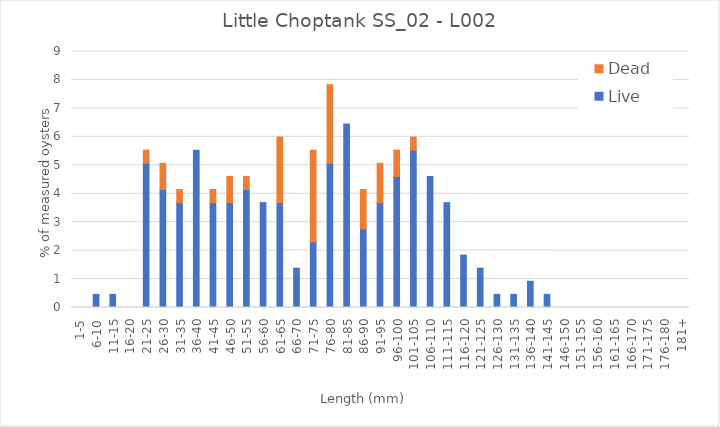
| Category | Live | Dead |
|---|---|---|
| 1-5 | 0 | 0 |
| 6-10 | 0.461 | 0 |
| 11-15 | 0.461 | 0 |
| 16-20 | 0 | 0 |
| 21-25 | 5.069 | 0.461 |
| 26-30 | 4.147 | 0.922 |
| 31-35 | 3.687 | 0.461 |
| 36-40 | 5.53 | 0 |
| 41-45 | 3.687 | 0.461 |
| 46-50 | 3.687 | 0.922 |
| 51-55 | 4.147 | 0.461 |
| 56-60 | 3.687 | 0 |
| 61-65 | 3.687 | 2.304 |
| 66-70 | 1.382 | 0 |
| 71-75 | 2.304 | 3.226 |
| 76-80 | 5.069 | 2.765 |
| 81-85 | 6.452 | 0 |
| 86-90 | 2.765 | 1.382 |
| 91-95 | 3.687 | 1.382 |
| 96-100 | 4.608 | 0.922 |
| 101-105 | 5.53 | 0.461 |
| 106-110 | 4.608 | 0 |
| 111-115 | 3.687 | 0 |
| 116-120 | 1.843 | 0 |
| 121-125 | 1.382 | 0 |
| 126-130 | 0.461 | 0 |
| 131-135 | 0.461 | 0 |
| 136-140 | 0.922 | 0 |
| 141-145 | 0.461 | 0 |
| 146-150 | 0 | 0 |
| 151-155 | 0 | 0 |
| 156-160 | 0 | 0 |
| 161-165 | 0 | 0 |
| 166-170 | 0 | 0 |
| 171-175 | 0 | 0 |
| 176-180 | 0 | 0 |
| 181+ | 0 | 0 |